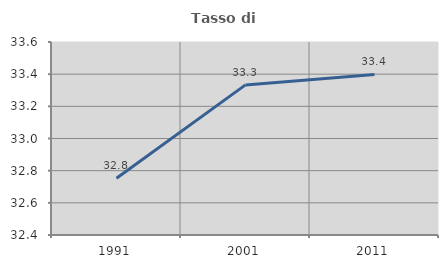
| Category | Tasso di occupazione   |
|---|---|
| 1991.0 | 32.753 |
| 2001.0 | 33.333 |
| 2011.0 | 33.398 |